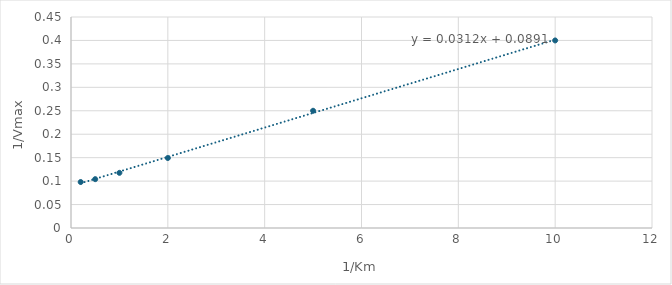
| Category | 1/Vmax |
|---|---|
| 10.0 | 0.4 |
| 5.0 | 0.25 |
| 2.0 | 0.149 |
| 1.0 | 0.118 |
| 0.5 | 0.104 |
| 0.2 | 0.098 |